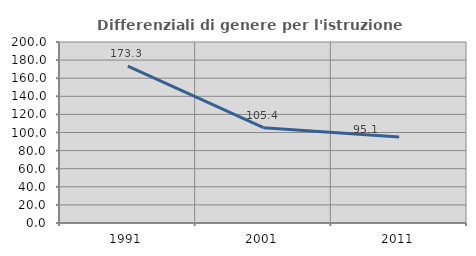
| Category | Differenziali di genere per l'istruzione superiore |
|---|---|
| 1991.0 | 173.288 |
| 2001.0 | 105.378 |
| 2011.0 | 95.092 |